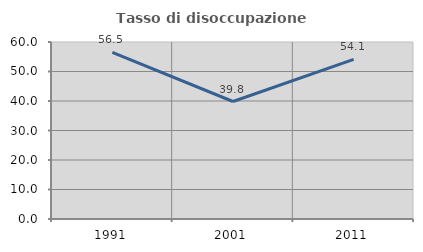
| Category | Tasso di disoccupazione giovanile  |
|---|---|
| 1991.0 | 56.452 |
| 2001.0 | 39.831 |
| 2011.0 | 54.118 |